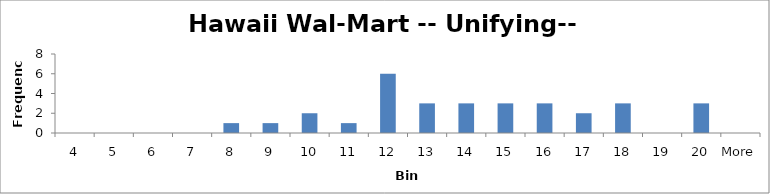
| Category | Frequency |
|---|---|
| 4 | 0 |
| 5 | 0 |
| 6 | 0 |
| 7 | 0 |
| 8 | 1 |
| 9 | 1 |
| 10 | 2 |
| 11 | 1 |
| 12 | 6 |
| 13 | 3 |
| 14 | 3 |
| 15 | 3 |
| 16 | 3 |
| 17 | 2 |
| 18 | 3 |
| 19 | 0 |
| 20 | 3 |
| More | 0 |